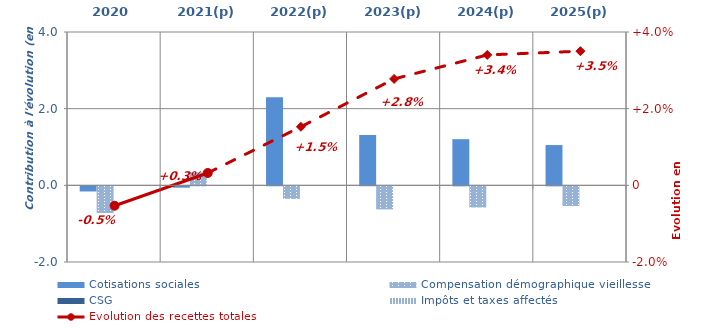
| Category | Cotisations sociales | Compensation démographique vieillesse | CSG | Impôts et taxes affectés |
|---|---|---|---|---|
| 2020 | -0.134 | -0.697 | 0 | 0 |
| 2021(p) | -0.035 | 0.339 | 0 | 0 |
| 2022(p) | 2.295 | -0.326 | 0 | 0 |
| 2023(p) | 1.315 | -0.602 | 0 | 0 |
| 2024(p) | 1.204 | -0.551 | 0 | 0 |
| 2025(p) | 1.051 | -0.513 | 0 | 0 |